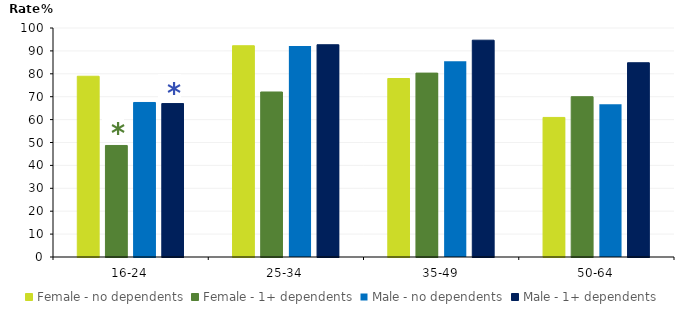
| Category | Female - no dependents | Female - 1+ dependents | Male - no dependents | Male - 1+ dependents |
|---|---|---|---|---|
| 16-24 | 78.93 | 48.7 | 67.477 | 67 |
| 25-34 | 92.253 | 72.057 | 92.178 | 92.687 |
| 35-49 | 77.944 | 80.307 | 85.468 | 94.679 |
| 50-64 | 60.947 | 70.001 | 66.717 | 84.83 |